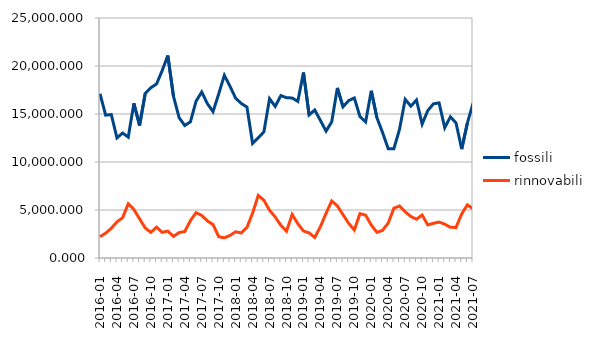
| Category | fossili | rinnovabili |
|---|---|---|
| 2016-01 | 17110 | 2226 |
| 2016-02 | 14881 | 2581 |
| 2016-03 | 14938 | 3099 |
| 2016-04 | 12509 | 3764 |
| 2016-05 | 13017 | 4192 |
| 2016-06 | 12591 | 5647 |
| 2016-07 | 16109 | 5048 |
| 2016-08 | 13798 | 4079 |
| 2016-09 | 17140 | 3131 |
| 2016-10 | 17735 | 2668 |
| 2016-11 | 18114 | 3215 |
| 2016-12 | 19519 | 2673 |
| 2017-01 | 21089 | 2804 |
| 2017-02 | 16850 | 2249 |
| 2017-03 | 14618 | 2648 |
| 2017-04 | 13803 | 2759 |
| 2017-05 | 14186 | 3896 |
| 2017-06 | 16333 | 4718 |
| 2017-07 | 17292 | 4434 |
| 2017-08 | 16079 | 3860 |
| 2017-09 | 15243 | 3485 |
| 2017-10 | 17081 | 2226 |
| 2017-11 | 19032 | 2101 |
| 2017-12 | 17894 | 2350 |
| 2018-01 | 16650 | 2731 |
| 2018-02 | 16093 | 2601 |
| 2018-03 | 15725 | 3187 |
| 2018-04 | 11940 | 4675 |
| 2018-05 | 12513 | 6518 |
| 2018-06 | 13137 | 6018 |
| 2018-07 | 16596 | 4968 |
| 2018-08 | 15792 | 4273 |
| 2018-09 | 16918 | 3397 |
| 2018-10 | 16696 | 2796 |
| 2018-11 | 16671 | 4535 |
| 2018-12 | 16315 | 3576 |
| 2019-01 | 19328 | 2815 |
| 2019-02 | 14902 | 2612 |
| 2019-03 | 15418 | 2136 |
| 2019-04 | 14326 | 3267 |
| 2019-05 | 13215 | 4649 |
| 2019-06 | 14181 | 5942 |
| 2019-07 | 17718 | 5425 |
| 2019-08 | 15749 | 4511 |
| 2019-09 | 16396 | 3613 |
| 2019-10 | 16669 | 2910 |
| 2019-11 | 14728 | 4621 |
| 2019-12 | 14181 | 4458 |
| 2020-01 | 17421 | 3431 |
| 2020-02 | 14605 | 2674 |
| 2020-03 | 13069 | 2878 |
| 2020-04 | 11379 | 3641 |
| 2020-05 | 11385 | 5188 |
| 2020-06 | 13408 | 5416 |
| 2020-07 | 16528 | 4812 |
| 2020-08 | 15813 | 4322 |
| 2020-09 | 16458 | 4046 |
| 2020-10 | 13951 | 4478 |
| 2020-11 | 15355 | 3444 |
| 2020-12 | 16061 | 3615 |
| 2021-01 | 16160 | 3743 |
| 2021-02 | 13571 | 3526 |
| 2021-03 | 14706 | 3195 |
| 2021-04 | 14066 | 3186 |
| 2021-05 | 11339 | 4599 |
| 2021-06 | 14052 | 5538 |
| 2021-07 | 16096 | 5132 |